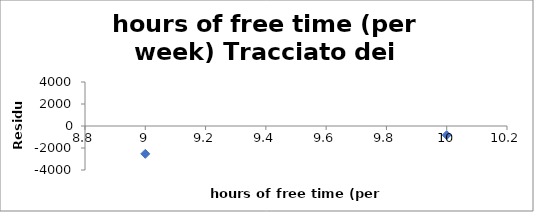
| Category | Series 0 |
|---|---|
| 0 | -932.022 |
| 1 | 2348.883 |
| 2 | -843.125 |
| 3 | 200.962 |
| 4 | 1009.679 |
| 5 | -35.132 |
| 6 | 2417.271 |
| 7 | -810.465 |
| 8 | -2530.649 |
| 9 | -825.402 |